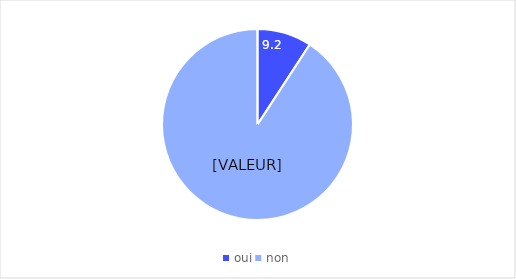
| Category | Series 0 |
|---|---|
| oui | 9.2 |
| non | 90.8 |